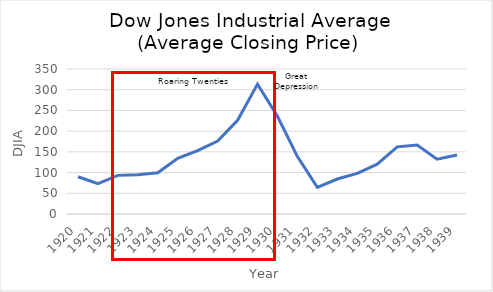
| Category | Series 0 |
|---|---|
| 1920.0 | 90.01 |
| 1921.0 | 73.39 |
| 1922.0 | 93.24 |
| 1923.0 | 94.87 |
| 1924.0 | 99.65 |
| 1925.0 | 134.4 |
| 1926.0 | 153 |
| 1927.0 | 176.07 |
| 1928.0 | 226.17 |
| 1929.0 | 313.54 |
| 1930.0 | 236.04 |
| 1931.0 | 138.6 |
| 1932.0 | 64.53 |
| 1933.0 | 84.5 |
| 1934.0 | 98.16 |
| 1935.0 | 120.35 |
| 1936.0 | 162.07 |
| 1937.0 | 166.45 |
| 1938.0 | 132.36 |
| 1939.0 | 142.57 |